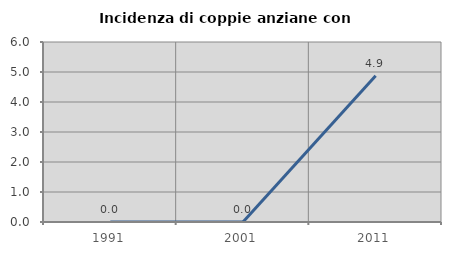
| Category | Incidenza di coppie anziane con figli |
|---|---|
| 1991.0 | 0 |
| 2001.0 | 0 |
| 2011.0 | 4.878 |